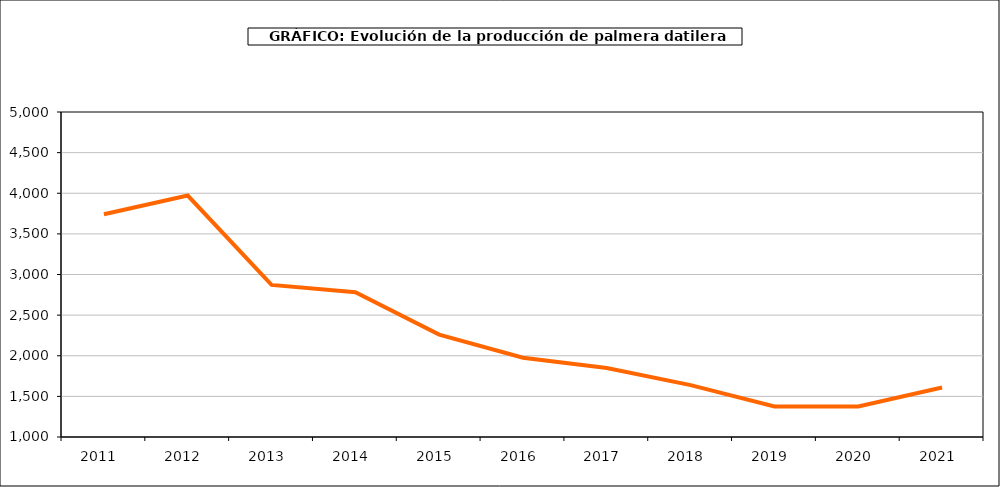
| Category | producción kiwi |
|---|---|
| 2011.0 | 3741 |
| 2012.0 | 3972 |
| 2013.0 | 2872 |
| 2014.0 | 2781 |
| 2015.0 | 2260 |
| 2016.0 | 1975 |
| 2017.0 | 1848 |
| 2018.0 | 1638 |
| 2019.0 | 1375 |
| 2020.0 | 1375 |
| 2021.0 | 1609 |